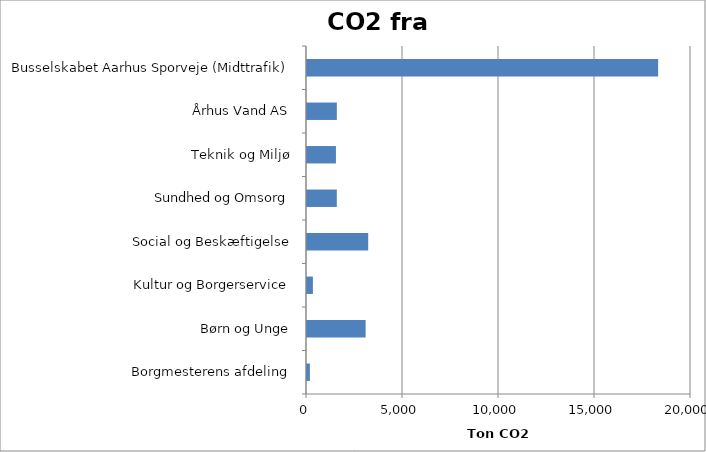
| Category | Ton CO2 |
|---|---|
| Borgmesterens afdeling | 149.789 |
| Børn og Unge | 3052.592 |
| Kultur og Borgerservice | 307.38 |
| Social og Beskæftigelse | 3187.406 |
| Sundhed og Omsorg | 1552.631 |
| Teknik og Miljø | 1507.477 |
| Århus Vand AS | 1554.284 |
| Busselskabet Aarhus Sporveje (Midttrafik) | 18288.215 |